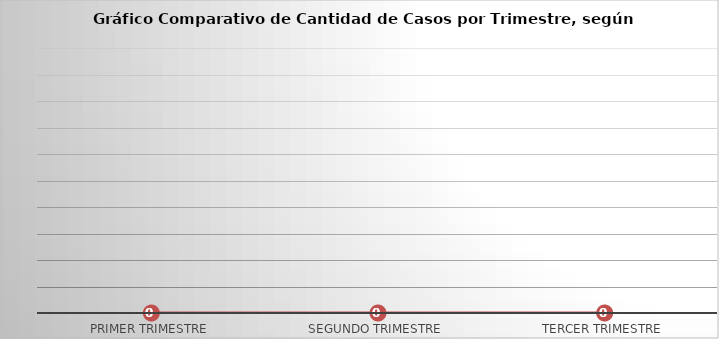
| Category | Series 0 |
|---|---|
| Primer Trimestre | 0 |
| Segundo Trimestre | 0 |
| Tercer Trimestre | 0 |